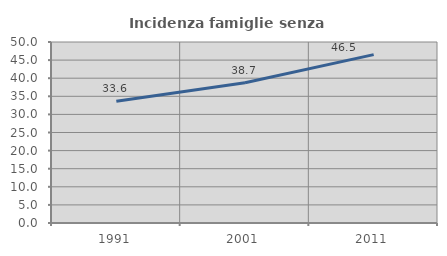
| Category | Incidenza famiglie senza nuclei |
|---|---|
| 1991.0 | 33.641 |
| 2001.0 | 38.74 |
| 2011.0 | 46.515 |